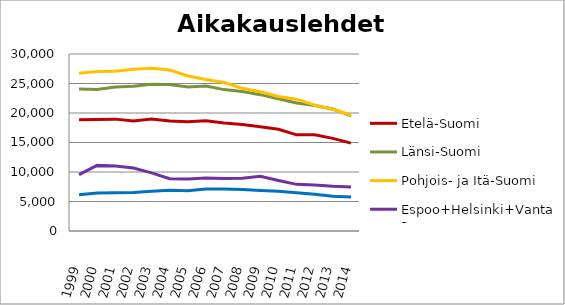
| Category | Etelä-Suomi | Länsi-Suomi | Pohjois- ja Itä-Suomi | Espoo+Helsinki+Vantaa | Muu Uusimaa |
|---|---|---|---|---|---|
| 1999.0 | 18837 | 24074 | 26756 | 9555 | 6162 |
| 2000.0 | 18919 | 23982 | 27038 | 11121 | 6445 |
| 2001.0 | 18961 | 24403 | 27068 | 11000 | 6480 |
| 2002.0 | 18630 | 24550 | 27408 | 10665 | 6543 |
| 2003.0 | 18975 | 24878 | 27583 | 9850 | 6722 |
| 2004.0 | 18651 | 24845 | 27292 | 8856 | 6892 |
| 2005.0 | 18510 | 24428 | 26275 | 8826 | 6828 |
| 2006.0 | 18690 | 24566 | 25691 | 8987 | 7127 |
| 2007.0 | 18317 | 23964 | 25156 | 8880 | 7101 |
| 2008.0 | 18033 | 23643 | 24193 | 8929 | 7034 |
| 2009.0 | 17665 | 23109 | 23587 | 9290 | 6880 |
| 2010.0 | 17249 | 22420 | 22801 | 8568 | 6756 |
| 2011.0 | 16302 | 21685 | 22344 | 7906 | 6476 |
| 2012.0 | 16311 | 21267 | 21311 | 7798 | 6219 |
| 2013.0 | 15695 | 20687 | 20627 | 7575 | 5890 |
| 2014.0 | 14900 | 19515 | 19670 | 7474 | 5743 |